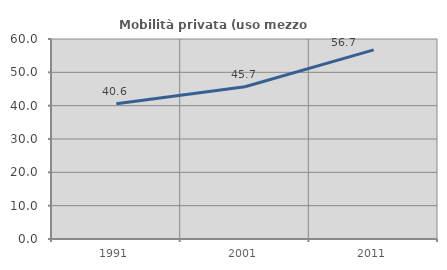
| Category | Mobilità privata (uso mezzo privato) |
|---|---|
| 1991.0 | 40.588 |
| 2001.0 | 45.688 |
| 2011.0 | 56.748 |